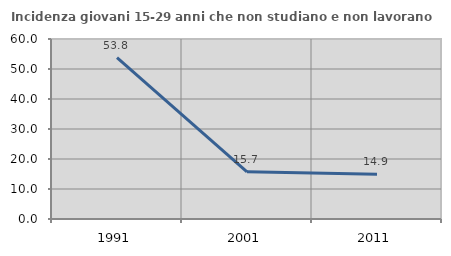
| Category | Incidenza giovani 15-29 anni che non studiano e non lavorano  |
|---|---|
| 1991.0 | 53.797 |
| 2001.0 | 15.745 |
| 2011.0 | 14.902 |